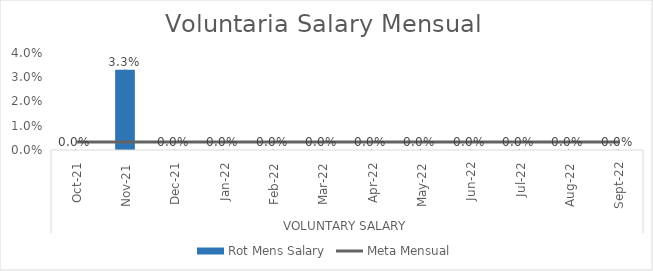
| Category | Series 6 | Rot Mens Salary | Series 4 | Series 5 |
|---|---|---|---|---|
| 0 |  | 0 |  |  |
| 1 |  | 0.033 |  |  |
| 2 |  | 0 |  |  |
| 3 |  | 0 |  |  |
| 4 |  | 0 |  |  |
| 5 |  | 0 |  |  |
| 6 |  | 0 |  |  |
| 7 |  | 0 |  |  |
| 8 |  | 0 |  |  |
| 9 |  | 0 |  |  |
| 10 |  | 0 |  |  |
| 11 |  | 0 |  |  |